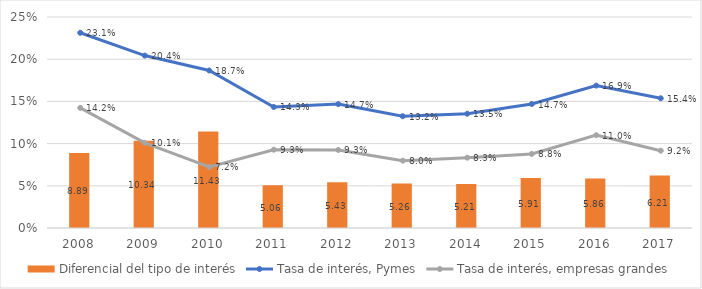
| Category | Diferencial del tipo de interés |
|---|---|
| 2008.0 | 0.089 |
| 2009.0 | 0.103 |
| 2010.0 | 0.114 |
| 2011.0 | 0.051 |
| 2012.0 | 0.054 |
| 2013.0 | 0.053 |
| 2014.0 | 0.052 |
| 2015.0 | 0.059 |
| 2016.0 | 0.059 |
| 2017.0 | 0.062 |